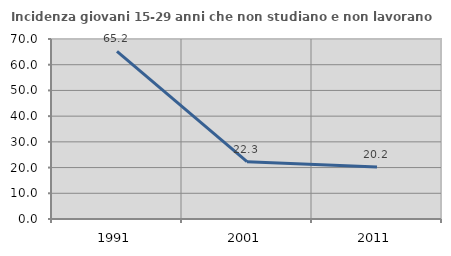
| Category | Incidenza giovani 15-29 anni che non studiano e non lavorano  |
|---|---|
| 1991.0 | 65.226 |
| 2001.0 | 22.271 |
| 2011.0 | 20.189 |